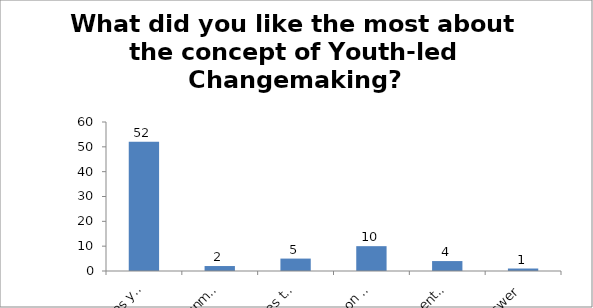
| Category | What did you like the most about the concept of Youth-led Changemaking? |
|---|---|
| It activates young people as Changemakers | 52 |
| It meets unmet service needs of the society | 2 |
| It redefines the field of youth development | 5 |
| It focuses on all (troubled and prepared) young people | 10 |
| It aims at enterprising education | 4 |
| No Answer | 1 |